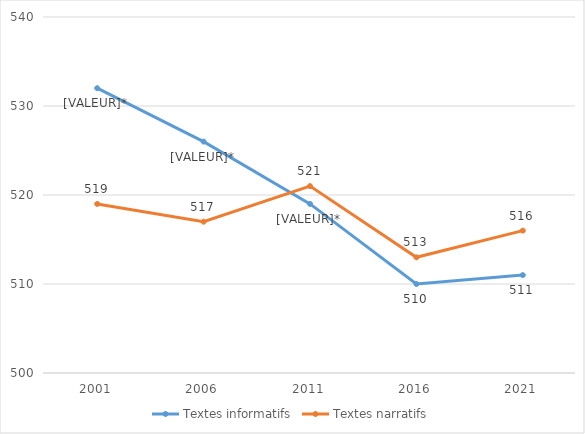
| Category | Textes informatifs | Textes narratifs |
|---|---|---|
| 2001.0 | 532 | 519 |
| 2006.0 | 526 | 517 |
| 2011.0 | 519 | 521 |
| 2016.0 | 510 | 513 |
| 2021.0 | 511 | 516 |